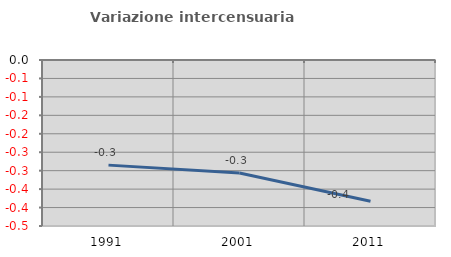
| Category | Variazione intercensuaria annua |
|---|---|
| 1991.0 | -0.285 |
| 2001.0 | -0.306 |
| 2011.0 | -0.383 |